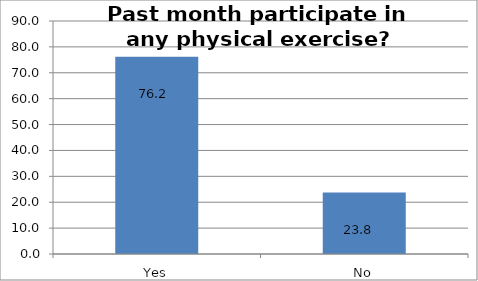
| Category | Series 0 |
|---|---|
| Yes | 76.197 |
| No | 23.803 |